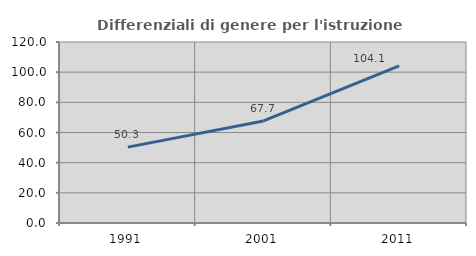
| Category | Differenziali di genere per l'istruzione superiore |
|---|---|
| 1991.0 | 50.29 |
| 2001.0 | 67.673 |
| 2011.0 | 104.134 |